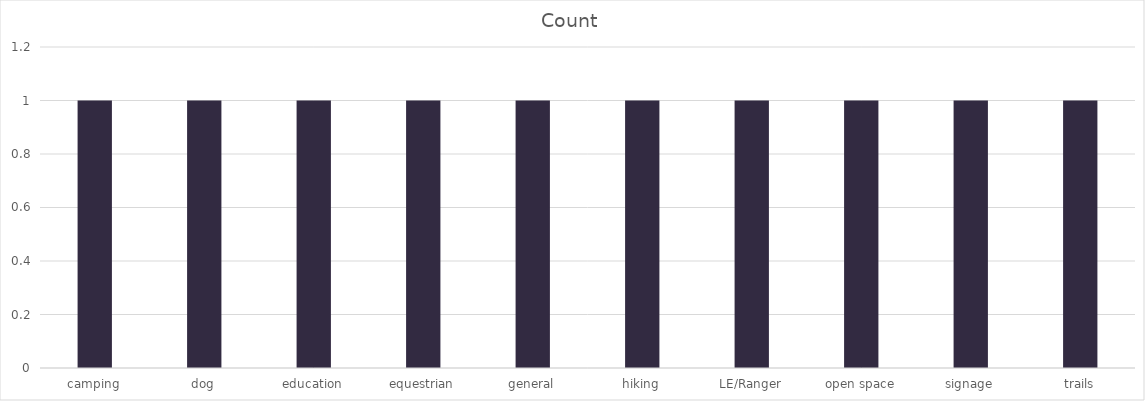
| Category | Count |
|---|---|
| camping | 1 |
| dog | 1 |
| education | 1 |
| equestrian | 1 |
| general | 1 |
| hiking | 1 |
| LE/Ranger | 1 |
| open space | 1 |
| signage | 1 |
| trails | 1 |